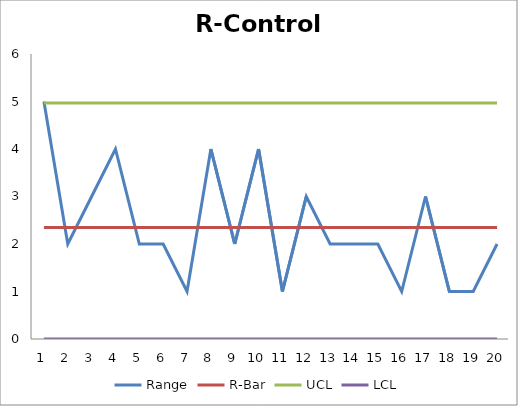
| Category | Range | R-Bar | UCL | LCL |
|---|---|---|---|---|
| 0 | 5 | 2.35 | 4.968 | 0 |
| 1 | 2 | 2.35 | 4.968 | 0 |
| 2 | 3 | 2.35 | 4.968 | 0 |
| 3 | 4 | 2.35 | 4.968 | 0 |
| 4 | 2 | 2.35 | 4.968 | 0 |
| 5 | 2 | 2.35 | 4.968 | 0 |
| 6 | 1 | 2.35 | 4.968 | 0 |
| 7 | 4 | 2.35 | 4.968 | 0 |
| 8 | 2 | 2.35 | 4.968 | 0 |
| 9 | 4 | 2.35 | 4.968 | 0 |
| 10 | 1 | 2.35 | 4.968 | 0 |
| 11 | 3 | 2.35 | 4.968 | 0 |
| 12 | 2 | 2.35 | 4.968 | 0 |
| 13 | 2 | 2.35 | 4.968 | 0 |
| 14 | 2 | 2.35 | 4.968 | 0 |
| 15 | 1 | 2.35 | 4.968 | 0 |
| 16 | 3 | 2.35 | 4.968 | 0 |
| 17 | 1 | 2.35 | 4.968 | 0 |
| 18 | 1 | 2.35 | 4.968 | 0 |
| 19 | 2 | 2.35 | 4.968 | 0 |